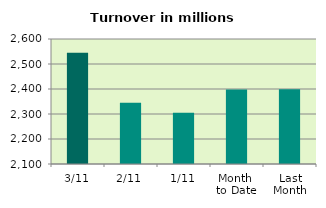
| Category | Series 0 |
|---|---|
| 3/11 | 2544.675 |
| 2/11 | 2344.522 |
| 1/11 | 2305.307 |
| Month 
to Date | 2398.168 |
| Last
Month | 2399.244 |